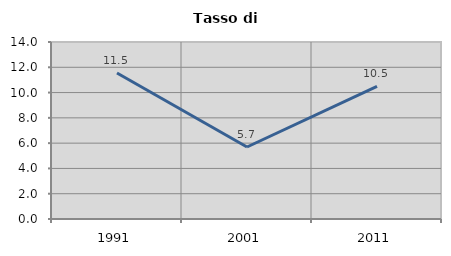
| Category | Tasso di disoccupazione   |
|---|---|
| 1991.0 | 11.545 |
| 2001.0 | 5.695 |
| 2011.0 | 10.483 |